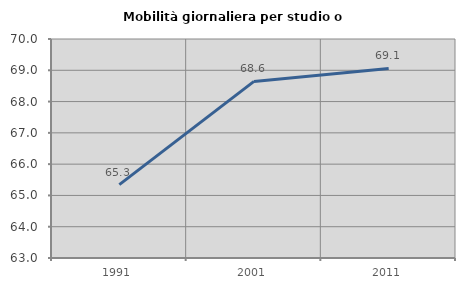
| Category | Mobilità giornaliera per studio o lavoro |
|---|---|
| 1991.0 | 65.345 |
| 2001.0 | 68.645 |
| 2011.0 | 69.058 |